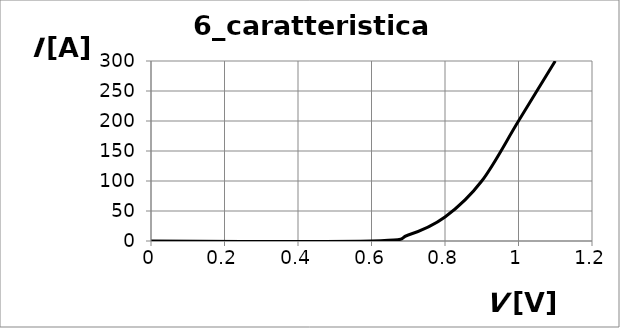
| Category | Series 0 |
|---|---|
| 0.0 | 0 |
| 0.6 | 0 |
| 0.7 | 10 |
| 0.7999999999999999 | 40 |
| 0.8999999999999999 | 100 |
| 0.9999999999999999 | 200 |
| 1.0999999999999999 | 300 |